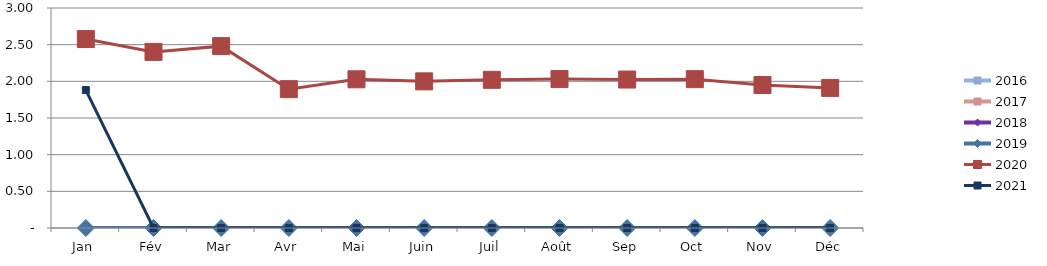
| Category | 2015 | 2016 | 2017 | 2018 | 2019 | 2020 | 2021 |
|---|---|---|---|---|---|---|---|
| Jan |  | 0 | 0 | 0 | 0 | 2.576 | 1.881 |
| Fév |  | 0 | 0 | 0 | 0 | 2.401 | 0 |
| Mar |  | 0 | 0 | 0 | 0 | 2.48 | 0 |
| Avr |  | 0 | 0 | 0 | 0 | 1.893 | 0 |
| Mai |  | 0 | 0 | 0 | 0 | 2.028 | 0 |
| Juin |  | 0 | 0 | 0 | 0 | 2 | 0 |
| Juil |  | 0 | 0 | 0 | 0 | 2.021 | 0 |
| Août |  | 0 | 0 | 0 | 0 | 2.031 | 0 |
| Sep |  | 0 | 0 | 0 | 0 | 2.024 | 0 |
| Oct |  | 0 | 0 | 0 | 0 | 2.03 | 0 |
| Nov |  | 0 | 0 | 0 | 0 | 1.95 | 0 |
| Déc |  | 0 | 0 | 0 | 0 | 1.91 | 0 |